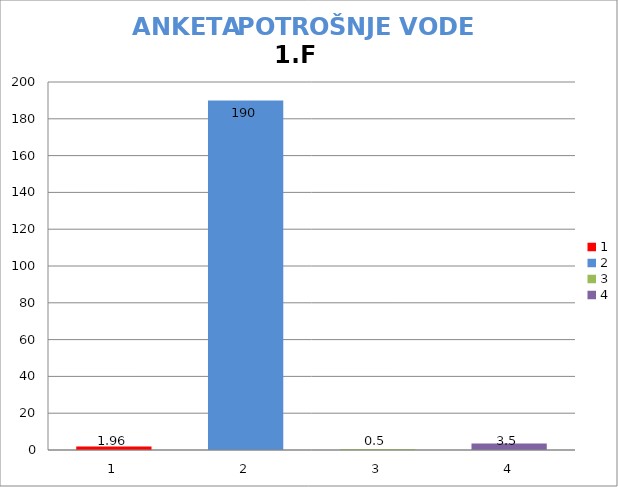
| Category | prosječna potrošnja | stvarna potrošnja | minimalna potrošnja | maksimalna potrošnja |
|---|---|---|---|---|
| 0 | 1.96 |  |  |  |
| 1 | 190 |  |  |  |
| 2 | 0.5 |  |  |  |
| 3 | 3.5 |  |  |  |